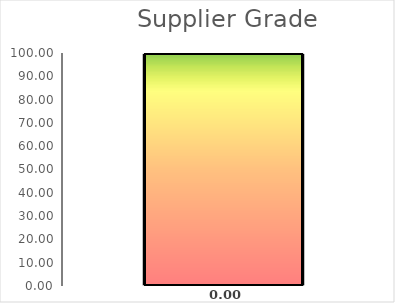
| Category | Seri 1 | Series 1 |
|---|---|---|
| TOTAL SCORE | 0 | 100 |